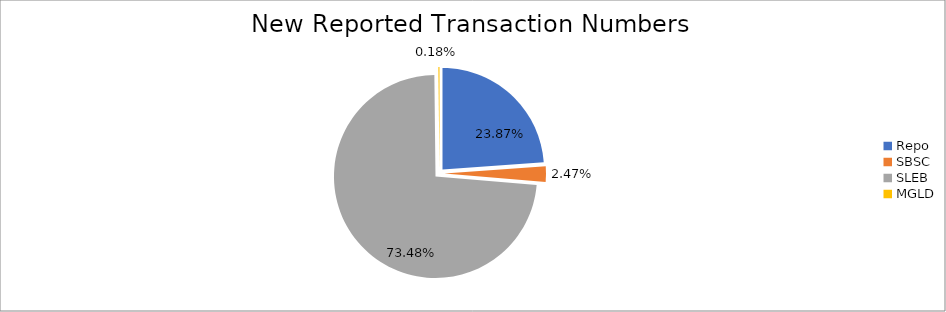
| Category | Series 0 |
|---|---|
| Repo | 407975 |
| SBSC | 42198 |
| SLEB | 1255966 |
| MGLD | 3069 |